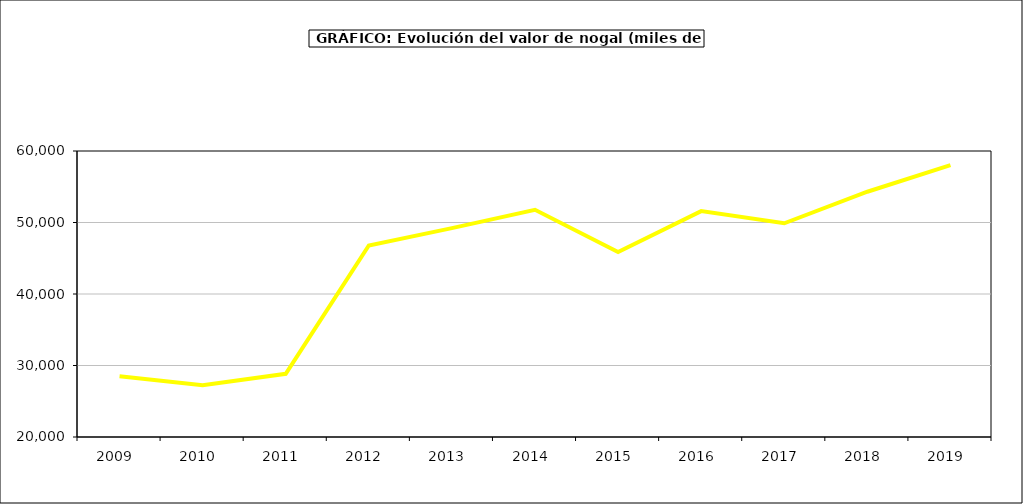
| Category | valor nogal |
|---|---|
| 2009.0 | 28498.427 |
| 2010.0 | 27232.257 |
| 2011.0 | 28841.576 |
| 2012.0 | 46777.981 |
| 2013.0 | 49217.301 |
| 2014.0 | 51776.04 |
| 2015.0 | 45857 |
| 2016.0 | 51595 |
| 2017.0 | 49891.162 |
| 2018.0 | 54304.281 |
| 2019.0 | 58028.936 |